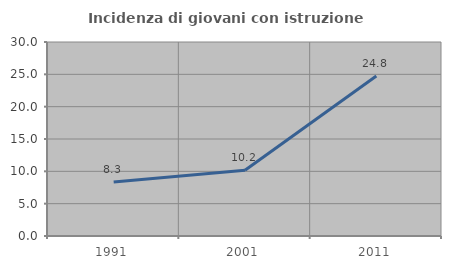
| Category | Incidenza di giovani con istruzione universitaria |
|---|---|
| 1991.0 | 8.333 |
| 2001.0 | 10.169 |
| 2011.0 | 24.752 |